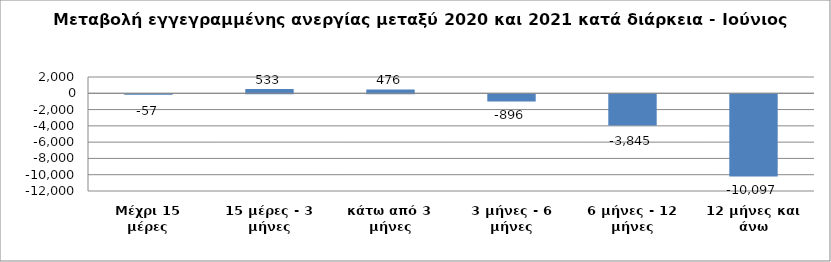
| Category | Series 0 |
|---|---|
| Μέχρι 15 μέρες | -57 |
| 15 μέρες - 3 μήνες | 533 |
| κάτω από 3 μήνες | 476 |
| 3 μήνες - 6 μήνες | -896 |
| 6 μήνες - 12 μήνες | -3845 |
| 12 μήνες και άνω | -10097 |